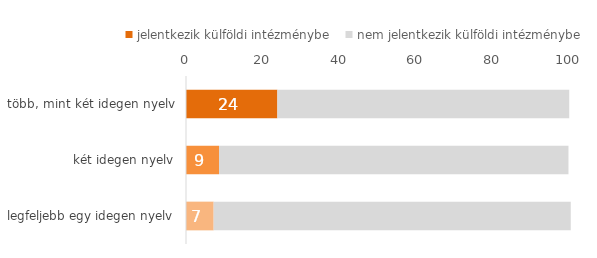
| Category | jelentkezik külföldi intézménybe  | nem jelentkezik külföldi intézménybe  |
|---|---|---|
| legfeljebb egy idegen nyelv | 7.2 | 93 |
| két idegen nyelv | 8.6 | 91 |
| több, mint két idegen nyelv | 23.8 | 76 |